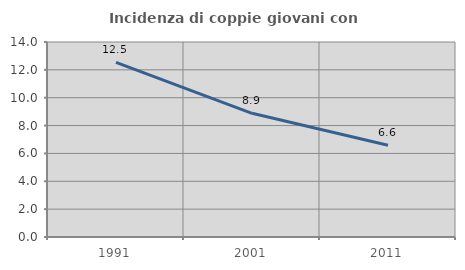
| Category | Incidenza di coppie giovani con figli |
|---|---|
| 1991.0 | 12.533 |
| 2001.0 | 8.881 |
| 2011.0 | 6.582 |